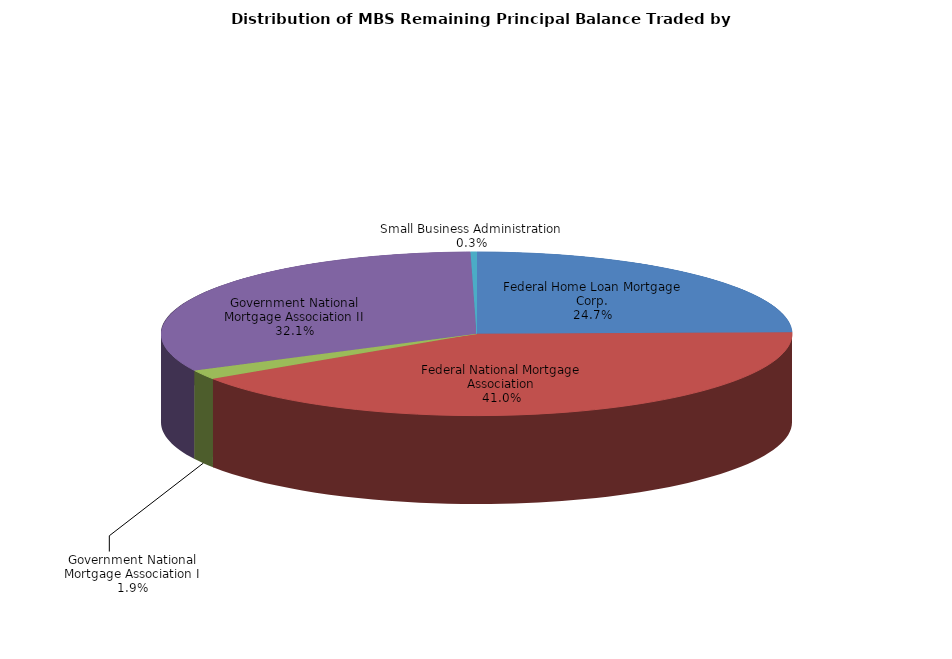
| Category | Series 0 |
|---|---|
| Federal Home Loan Mortgage Corp. | 2874942947.304 |
| Federal National Mortgage Association | 4775576759.492 |
| Government National Mortgage Association I | 215890649.464 |
| Government National Mortgage Association II | 3736729353.551 |
| Small Business Administration | 35344282.889 |